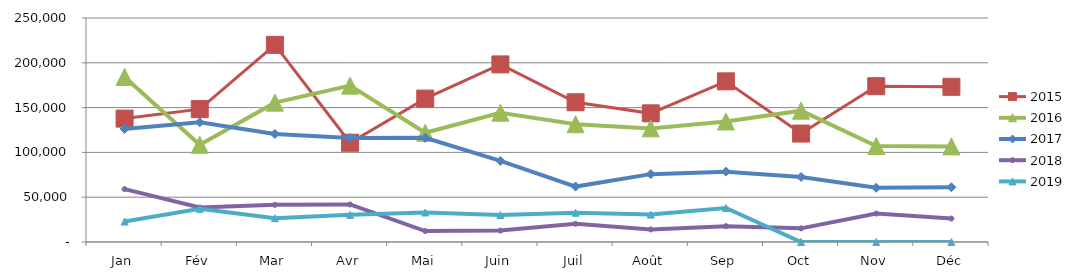
| Category | 2015 | 2016 | 2017 | 2018 | 2019 |
|---|---|---|---|---|---|
| Jan | 137713.474 | 184232.553 | 126197.515 | 58992.727 | 22835.141 |
| Fév | 148295.278 | 108445.311 | 133601.162 | 38474.634 | 36964.987 |
| Mar | 220042.177 | 155536.423 | 120591.652 | 41446.118 | 26566.504 |
| Avr | 110781.335 | 174480.572 | 116118.947 | 41867.578 | 30312.298 |
| Mai | 160048.852 | 121919.747 | 116249.349 | 12225.209 | 32920.271 |
| Juin | 198197.034 | 144314.426 | 90555.217 | 12731.198 | 30030.503 |
| Juil | 155965.43 | 131454.744 | 61851.658 | 20324.43 | 32688.868 |
| Août | 143590.344 | 126814.647 | 75725.137 | 14054.589 | 30593.377 |
| Sep | 179276.03 | 134534.845 | 78513.546 | 17695.021 | 37905.19 |
| Oct | 121038.645 | 146556.306 | 72510.099 | 15242.364 | 0 |
| Nov | 173874.86 | 107167.576 | 60542.91 | 31689.585 | 0 |
| Déc | 173191.088 | 106719.407 | 61092.454 | 26183.332 | 0 |